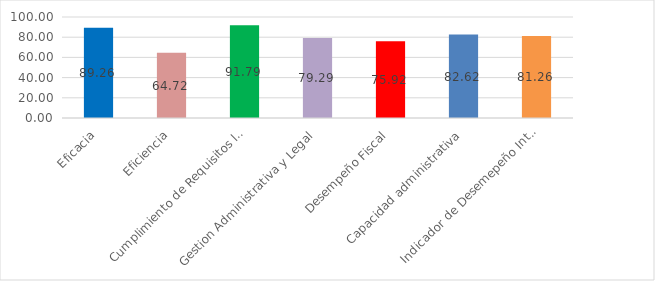
| Category | Series 0 |
|---|---|
| Eficacia | 89.26 |
| Eficiencia | 64.72 |
| Cumplimiento de Requisitos legales | 91.79 |
| Gestion Administrativa y Legal | 79.29 |
| Desempeño Fiscal | 75.92 |
| Capacidad administrativa | 82.62 |
| Indicador de Desemepeño Integral | 81.26 |